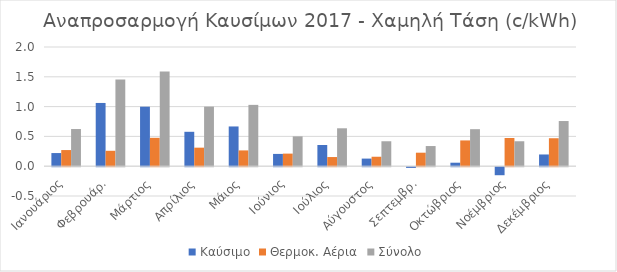
| Category | Καύσιμο | Θερμοκ. Αέρια | Σύνολο |
|---|---|---|---|
| Ιανουάριος | 0.221 | 0.271 | 0.624 |
| Φεβρουάρ. | 1.061 | 0.259 | 1.455 |
| Μάρτιος | 0.998 | 0.476 | 1.588 |
| Απρίλιος | 0.577 | 0.311 | 1 |
| Μάιος | 0.667 | 0.265 | 1.029 |
| Ιούνιος | 0.206 | 0.211 | 0.5 |
| Ιούλιος | 0.356 | 0.154 | 0.636 |
| Αύγουστος | 0.128 | 0.159 | 0.419 |
| Σεπτεμβρ. | -0.012 | 0.227 | 0.338 |
| Οκτώβριος | 0.059 | 0.432 | 0.621 |
| Νοέμβριος | -0.135 | 0.473 | 0.419 |
| Δεκέμβριος | 0.197 | 0.469 | 0.758 |